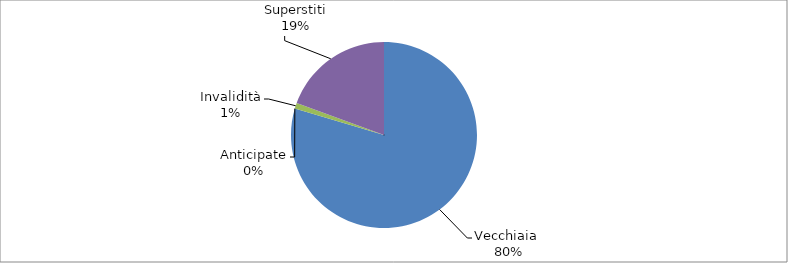
| Category | Series 0 |
|---|---|
| Vecchiaia  | 7666 |
| Anticipate | 0 |
| Invalidità | 96 |
| Superstiti | 1870 |